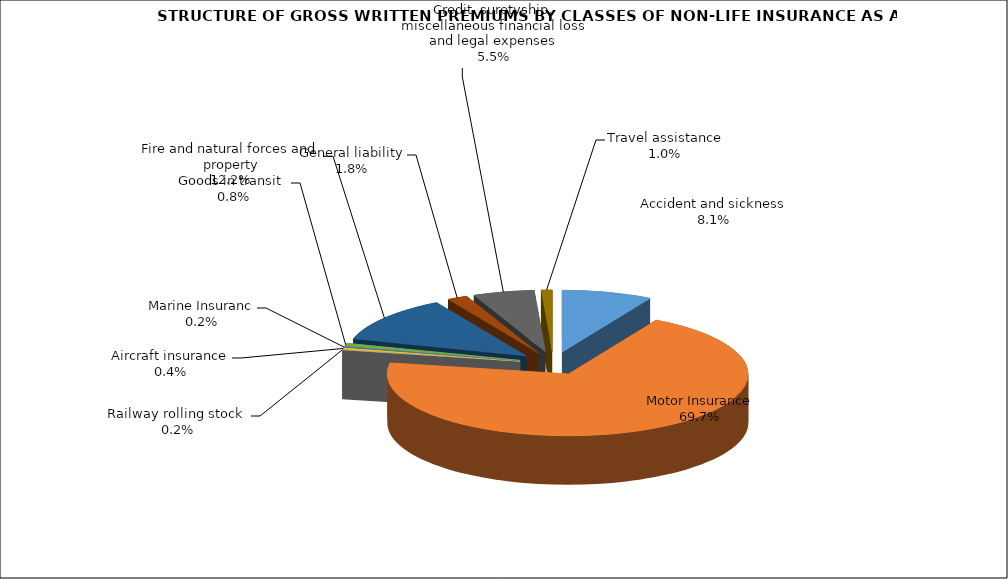
| Category | Accident and sickness | Series 1 |
|---|---|---|
| Accident and sickness | 0.081 |  |
| Motor Insurance | 0.697 |  |
| Railway rolling stock  | 0.002 |  |
| Aircraft insurance | 0.004 |  |
| Marine Insuranc | 0.002 |  |
| Goods in transit  | 0.008 |  |
| Fire and natural forces and property | 0.122 |  |
| General liability | 0.018 |  |
| Credit, suretyship, miscellaneous financial loss and legal expenses | 0.055 |  |
| Travel assistance | 0.01 |  |